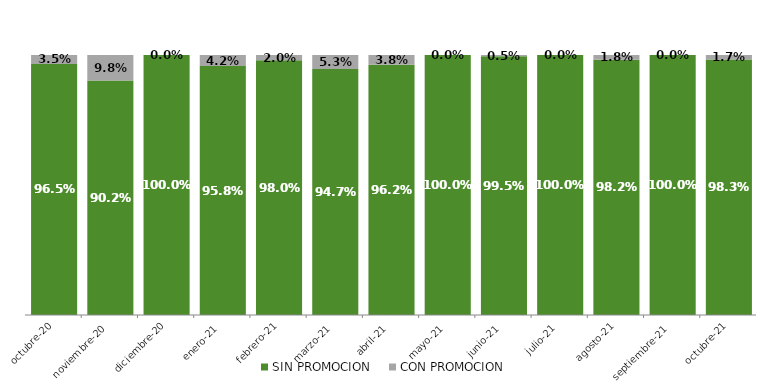
| Category | SIN PROMOCION   | CON PROMOCION   |
|---|---|---|
| 2020-10-01 | 0.965 | 0.035 |
| 2020-11-01 | 0.902 | 0.098 |
| 2020-12-01 | 1 | 0 |
| 2021-01-01 | 0.958 | 0.042 |
| 2021-02-01 | 0.98 | 0.02 |
| 2021-03-01 | 0.947 | 0.053 |
| 2021-04-01 | 0.962 | 0.038 |
| 2021-05-01 | 1 | 0 |
| 2021-06-01 | 0.995 | 0.005 |
| 2021-07-01 | 1 | 0 |
| 2021-08-01 | 0.982 | 0.018 |
| 2021-09-01 | 1 | 0 |
| 2021-10-01 | 0.983 | 0.017 |